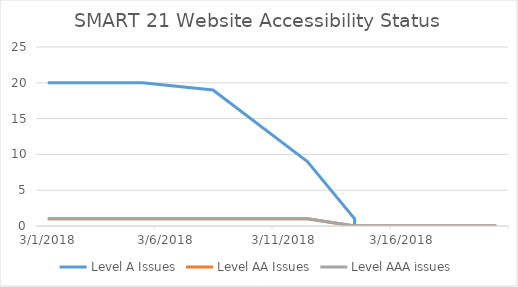
| Category | Level A Issues | Level AA Issues | Level AAA issues |
|---|---|---|---|
| 3/1/18 | 20 | 1 | 1 |
| 3/5/18 | 20 | 1 | 1 |
| 3/8/18 | 19 | 1 | 1 |
| 3/12/18 | 9 | 1 | 1 |
| 3/14/18 | 1 | 0 | 0 |
| 3/14/18 | 0 | 0 | 0 |
| 3/18/18 | 0 | 0 | 0 |
| 3/20/18 | 0 | 0 | 0 |